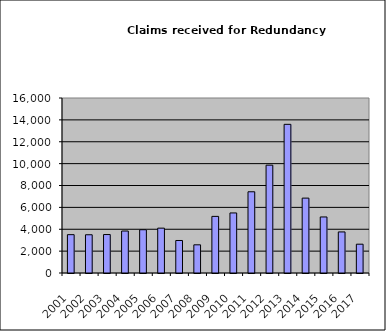
| Category | Series 0 |
|---|---|
| 2001.0 | 3505 |
| 2002.0 | 3497 |
| 2003.0 | 3516 |
| 2004.0 | 3838 |
| 2005.0 | 3956 |
| 2006.0 | 4101 |
| 2007.0 | 2972 |
| 2008.0 | 2577 |
| 2009.0 | 5177 |
| 2010.0 | 5491 |
| 2011.0 | 7426 |
| 2012.0 | 9860 |
| 2013.0 | 13592 |
| 2014.0 | 6846 |
| 2015.0 | 5123 |
| 2016.0 | 3755 |
| 2017.0 | 2634 |